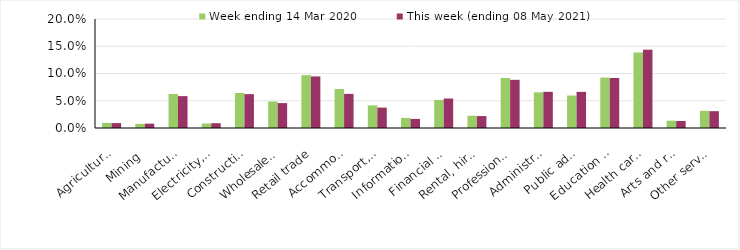
| Category | Week ending 14 Mar 2020 | This week (ending 08 May 2021) |
|---|---|---|
| Agriculture, forestry and fishing | 0.009 | 0.009 |
| Mining | 0.008 | 0.008 |
| Manufacturing | 0.062 | 0.058 |
| Electricity, gas, water and waste services | 0.008 | 0.009 |
| Construction | 0.064 | 0.062 |
| Wholesale trade | 0.049 | 0.046 |
| Retail trade | 0.097 | 0.095 |
| Accommodation and food services | 0.072 | 0.063 |
| Transport, postal and warehousing | 0.042 | 0.037 |
| Information media and telecommunications | 0.018 | 0.017 |
| Financial and insurance services | 0.052 | 0.054 |
| Rental, hiring and real estate services | 0.022 | 0.022 |
| Professional, scientific and technical services | 0.092 | 0.088 |
| Administrative and support services | 0.065 | 0.066 |
| Public administration and safety | 0.06 | 0.066 |
| Education and training | 0.092 | 0.092 |
| Health care and social assistance | 0.139 | 0.144 |
| Arts and recreation services | 0.013 | 0.013 |
| Other services | 0.032 | 0.031 |